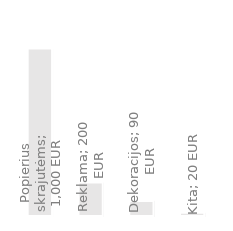
| Category | Metinės išlaidos |
|---|---|
| Popierius skrajutėms | 1000 |
| Reklama | 200 |
| Dekoracijos | 90 |
| Kita | 20 |